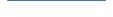
| Category | Series 0 |
|---|---|
| 0 | 26 |
| 1 | 30 |
| 2 | 22 |
| 3 | 33 |
| 4 | 30 |
| 5 | 26 |
| 6 | 31 |
| 7 | 27 |
| 8 | 28 |